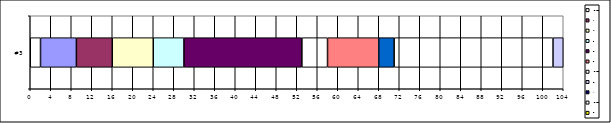
| Category | IDLE1 | A | H | F | D | B | IDLE2 | O | K | IDLE3 | T |
|---|---|---|---|---|---|---|---|---|---|---|---|
| #3 | 2 | 7 | 7 | 8 | 6 | 23 | 5 | 10 | 3 | 31 | 2 |